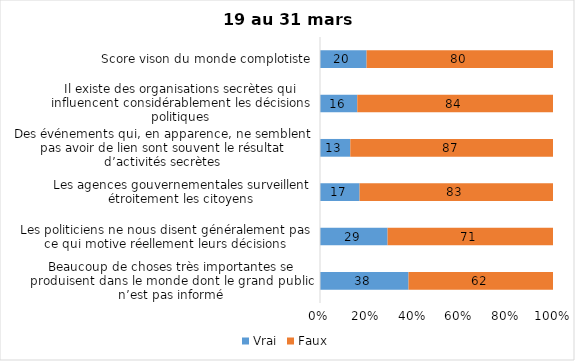
| Category | Vrai | Faux |
|---|---|---|
| Beaucoup de choses très importantes se produisent dans le monde dont le grand public n’est pas informé | 38 | 62 |
| Les politiciens ne nous disent généralement pas ce qui motive réellement leurs décisions | 29 | 71 |
| Les agences gouvernementales surveillent étroitement les citoyens | 17 | 83 |
| Des événements qui, en apparence, ne semblent pas avoir de lien sont souvent le résultat d’activités secrètes | 13 | 87 |
| Il existe des organisations secrètes qui influencent considérablement les décisions politiques | 16 | 84 |
| Score vison du monde complotiste | 20 | 80 |